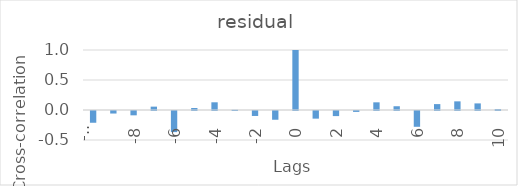
| Category | residual |
|---|---|
| -10.0 | -0.196 |
| -9.0 | -0.042 |
| -8.0 | -0.072 |
| -7.0 | 0.056 |
| -6.0 | -0.352 |
| -5.0 | 0.033 |
| -4.0 | 0.128 |
| -3.0 | 0.003 |
| -2.0 | -0.083 |
| -1.0 | -0.146 |
| 0.0 | 1 |
| 1.0 | -0.127 |
| 2.0 | -0.085 |
| 3.0 | -0.015 |
| 4.0 | 0.128 |
| 5.0 | 0.063 |
| 6.0 | -0.263 |
| 7.0 | 0.098 |
| 8.0 | 0.144 |
| 9.0 | 0.11 |
| 10.0 | 0.016 |